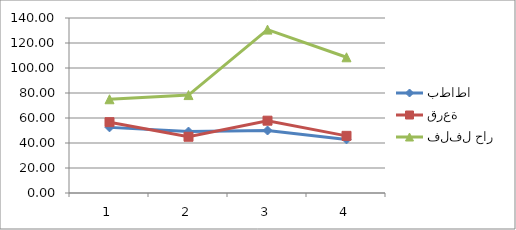
| Category | بطاطا | قرعة | فلفل حار |
|---|---|---|---|
| 0 | 52.5 | 56.667 | 75 |
| 1 | 49.167 | 45 | 78.333 |
| 2 | 50 | 57.857 | 130.714 |
| 3 | 42.857 | 45.714 | 108.571 |